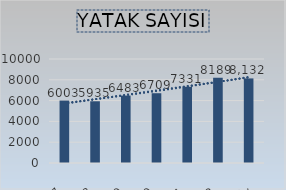
| Category | Series 6 |
|---|---|
| 2017 | 6003 |
| 2018 | 5935 |
| 2019 | 6483 |
| 2020 | 6709 |
| 2021 | 7331 |
| 2022 | 8189 |
| 2023(Ekim Ayı İtibariyle) | 8132 |